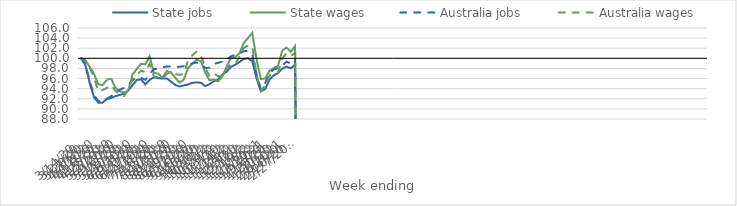
| Category | State jobs | State wages | Australia jobs | Australia wages |
|---|---|---|---|---|
| 14/03/2020 | 100 | 100 | 100 | 100 |
| 21/03/2020 | 98.626 | 99.585 | 98.956 | 99.591 |
| 28/03/2020 | 95.146 | 98.307 | 95.412 | 98.115 |
| 04/04/2020 | 92.299 | 96.972 | 92.813 | 96.238 |
| 11/04/2020 | 91.228 | 94.894 | 91.52 | 93.527 |
| 18/04/2020 | 91.233 | 94.686 | 91.497 | 93.722 |
| 25/04/2020 | 91.952 | 95.749 | 92.022 | 94.132 |
| 02/05/2020 | 92.165 | 96.002 | 92.516 | 94.683 |
| 09/05/2020 | 92.516 | 94.195 | 93.196 | 93.606 |
| 16/05/2020 | 92.748 | 93.492 | 93.786 | 92.839 |
| 23/05/2020 | 93.003 | 93.248 | 94.143 | 92.495 |
| 30/05/2020 | 93.676 | 93.593 | 94.652 | 93.805 |
| 06/06/2020 | 94.668 | 96.777 | 95.638 | 95.989 |
| 13/06/2020 | 95.707 | 97.856 | 96.141 | 96.647 |
| 20/06/2020 | 95.845 | 98.93 | 96.161 | 97.556 |
| 27/06/2020 | 94.845 | 98.805 | 95.749 | 97.243 |
| 04/07/2020 | 95.736 | 100.424 | 96.855 | 98.903 |
| 11/07/2020 | 96.254 | 97.141 | 97.864 | 96.396 |
| 18/07/2020 | 96.095 | 96.957 | 97.96 | 96.236 |
| 25/07/2020 | 95.991 | 96.21 | 98.177 | 96.05 |
| 01/08/2020 | 96.026 | 97.484 | 98.391 | 96.89 |
| 08/08/2020 | 95.385 | 97.237 | 98.384 | 97.377 |
| 15/08/2020 | 94.732 | 96.146 | 98.275 | 96.882 |
| 22/08/2020 | 94.427 | 95.22 | 98.328 | 96.723 |
| 29/08/2020 | 94.641 | 95.782 | 98.458 | 96.942 |
| 05/09/2020 | 94.831 | 98.131 | 98.618 | 99.637 |
| 12/09/2020 | 95.152 | 98.919 | 99.017 | 100.615 |
| 19/09/2020 | 95.242 | 99.731 | 99.166 | 101.346 |
| 26/09/2020 | 95.173 | 99.44 | 98.953 | 100.497 |
| 03/10/2020 | 94.495 | 97.182 | 98.095 | 98.1 |
| 10/10/2020 | 94.882 | 95.635 | 98.121 | 96.45 |
| 17/10/2020 | 95.437 | 95.811 | 98.87 | 97.028 |
| 24/10/2020 | 95.793 | 95.456 | 99.128 | 96.463 |
| 31/10/2020 | 96.772 | 96.415 | 99.332 | 96.583 |
| 07/11/2020 | 97.371 | 98.365 | 99.7 | 97.947 |
| 14/11/2020 | 98.294 | 100.188 | 100.404 | 98.872 |
| 21/11/2020 | 98.715 | 100.232 | 100.686 | 98.947 |
| 28/11/2020 | 99.27 | 100.993 | 100.954 | 100.289 |
| 05/12/2020 | 99.878 | 103.034 | 101.418 | 102.049 |
| 12/12/2020 | 100.014 | 104.036 | 101.44 | 102.491 |
| 19/12/2020 | 99.439 | 105.023 | 100.619 | 102.382 |
| 26/12/2020 | 96.019 | 99.764 | 96.814 | 96.897 |
| 02/01/2021 | 93.476 | 95.911 | 93.894 | 93.496 |
| 09/01/2021 | 93.944 | 96.003 | 95.102 | 94.672 |
| 16/01/2021 | 95.735 | 97.517 | 97.043 | 96.593 |
| 23/01/2021 | 96.657 | 98.079 | 97.81 | 97.069 |
| 30/01/2021 | 97.072 | 98.45 | 98.097 | 97.188 |
| 06/02/2021 | 97.935 | 101.544 | 98.579 | 99.942 |
| 13/02/2021 | 98.372 | 102.126 | 99.324 | 101.024 |
| 20/02/2021 | 98.027 | 101.277 | 98.998 | 100.508 |
| 27/02/2021 | 98.729 | 102.435 | 99.758 | 101.044 |